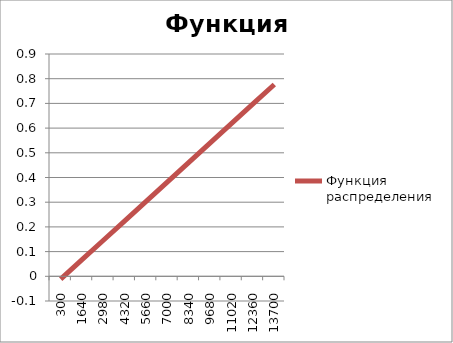
| Category | Функция распределения |
|---|---|
| 300.0 | -0.012 |
| 1640.0 | 0.067 |
| 2980.0 | 0.146 |
| 4320.0 | 0.225 |
| 5660.0 | 0.304 |
| 7000.0 | 0.382 |
| 8340.0 | 0.461 |
| 9680.0 | 0.54 |
| 11020.0 | 0.619 |
| 12360.0 | 0.698 |
| 13700.0 | 0.777 |